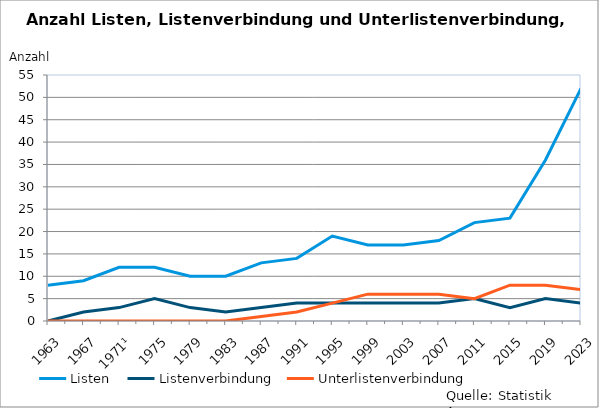
| Category | Listen | Listenverbindung | Unterlistenverbindung |
|---|---|---|---|
| 1963 | 8 | 0 | 0 |
| 1967 | 9 | 2 | 0 |
| 1971¹ | 12 | 3 | 0 |
| 1975 | 12 | 5 | 0 |
| 1979 | 10 | 3 | 0 |
| 1983 | 10 | 2 | 0 |
| 1987 | 13 | 3 | 1 |
| 1991 | 14 | 4 | 2 |
| 1995 | 19 | 4 | 4 |
| 1999 | 17 | 4 | 6 |
| 2003 | 17 | 4 | 6 |
| 2007 | 18 | 4 | 6 |
| 2011 | 22 | 5 | 5 |
| 2015 | 23 | 3 | 8 |
| 2019 | 36 | 5 | 8 |
| 2023 | 52 | 4 | 7 |